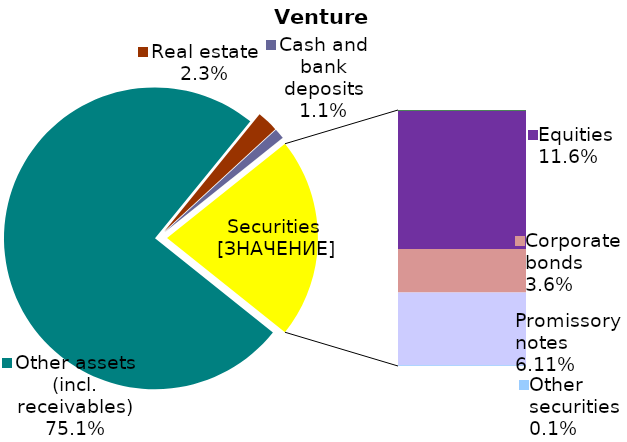
| Category | Venture CII |
|---|---|
| Other assets (incl. receivables) | 0.751 |
| Real estate | 0.023 |
| Cash and bank deposits | 0.011 |
| Bank metals | 0 |
| OVDP (State bonds) | 0.001 |
| Equities | 0.116 |
| Corporate bonds | 0.036 |
| Promissory notes | 0.061 |
| Mortgage Notes | 0 |
| Other securities | 0.001 |